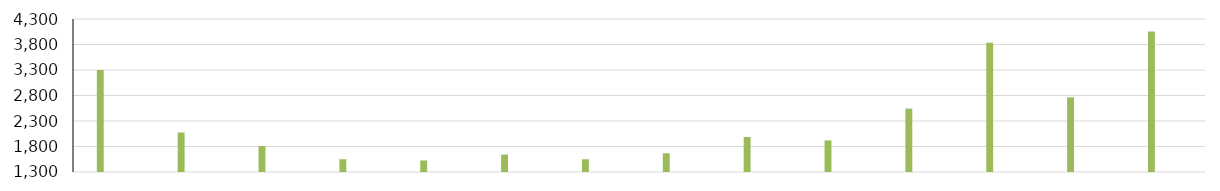
| Category | Вардарски | Источен | Југозападен | Југоисточен | Пелагониски | Полошки | Североисточен | Скопски |
|---|---|---|---|---|---|---|---|---|
| 2008 | 19.676 | 33.054 | 3300.516 | 208.678 | 152.086 | 46.013 | 4.817 | 247.521 |
| 2009 | 25.863 | 39.742 | 2074.815 | 262.988 | 162.137 | 62.641 | 7.557 | 233.855 |
| 2010 | 31.727 | 33.926 | 1810.463 | 270.031 | 203.248 | 72.261 | 5.934 | 266.451 |
| 2011 | 35.209 | 43.015 | 1550.307 | 538.913 | 226.052 | 51.51 | 7.334 | 307.229 |
| 2012 | 66.057 | 56.951 | 1526.676 | 392.263 | 209.768 | 60.501 | 10.695 | 313.641 |
| 2013 | 84.914 | 56.297 | 1642.121 | 317.251 | 187.661 | 67.692 | 12.922 | 340.509 |
| 2014 | 62.406 | 60.007 | 1549.805 | 571.977 | 196.57 | 65.472 | 15.566 | 350.547 |
| 2015 | 79.386 | 71.636 | 1667.594 | 363.598 | 181.047 | 93.528 | 23.591 | 394.933 |
| 2016 | 68.876 | 81.775 | 1986.24 | 490.908 | 161.318 | 69.029 | 23.926 | 459.232 |
| 2017 | 85.561 | 65.722 | 1919.473 | 504.036 | 202.151 | 85.569 | 29.293 | 550.962 |
| 2018 | 117.599 | 80.681 | 2543.148 | 650.601 | 313.924 | 96.197 | 26.116 | 582.469 |
| 2019 | 95.219 | 118.532 | 3835.499 | 639.68 | 367.654 | 115.757 | 16.496 | 596.6 |
| 2020 | 24.952 | 88.279 | 2763.758 | 420.076 | 125.492 | 80.915 | 10.37 | 147.087 |
| 2021 | 48.332 | 112.832 | 4056.477 | 697.686 | 144.159 | 115.586 | 7.837 | 372.839 |